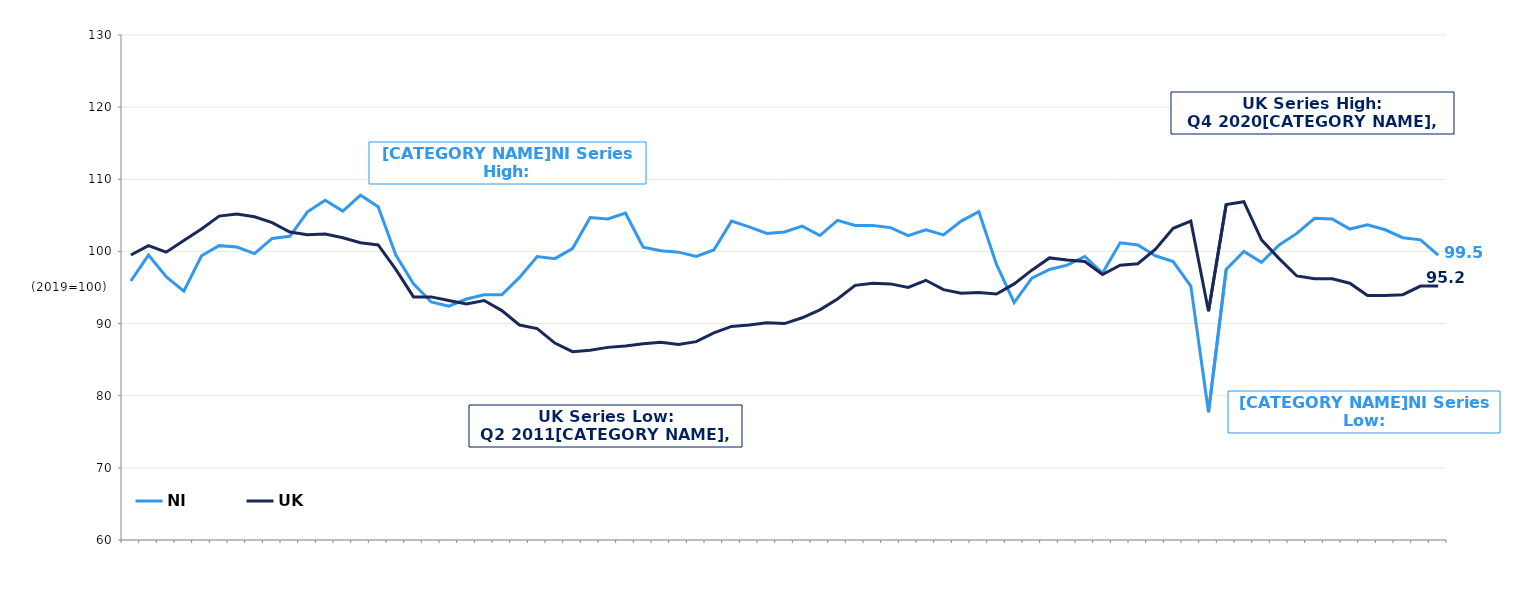
| Category | NI | UK  |
|---|---|---|
|  | 95.9 | 99.5 |
|  | 99.5 | 100.8 |
| Q3 2005 | 96.5 | 99.9 |
|  | 94.5 | 101.5 |
|  | 99.4 | 103.1 |
|  | 100.8 | 104.9 |
| Q3 2006 | 100.6 | 105.2 |
|  | 99.7 | 104.8 |
|  | 101.8 | 104 |
|  | 102.1 | 102.7 |
| Q3 2007 | 105.5 | 102.3 |
|  | 107.1 | 102.4 |
|  | 105.6 | 101.9 |
|  | 107.8 | 101.2 |
| Q3 2008 | 106.2 | 100.9 |
|  | 99.5 | 97.5 |
|  | 95.5 | 93.7 |
|  | 93 | 93.7 |
| Q3 2009 | 92.4 | 93.2 |
|  | 93.4 | 92.7 |
|  | 94 | 93.2 |
|  | 94 | 91.8 |
| Q3 2010 | 96.4 | 89.8 |
|  | 99.3 | 89.3 |
|  | 99 | 87.3 |
|  | 100.4 | 86.1 |
| Q3 2011 | 104.7 | 86.3 |
|  | 104.5 | 86.7 |
|  | 105.3 | 86.9 |
|  | 100.6 | 87.2 |
| Q3 2012 | 100.1 | 87.4 |
|  | 99.9 | 87.1 |
|  | 99.3 | 87.5 |
|  | 100.2 | 88.7 |
| Q3 2013 | 104.2 | 89.6 |
|  | 103.4 | 89.8 |
|  | 102.5 | 90.1 |
|  | 102.7 | 90 |
| Q3 2014 | 103.5 | 90.8 |
|  | 102.2 | 91.9 |
|  | 104.3 | 93.4 |
|  | 103.6 | 95.3 |
| Q3 2015 | 103.6 | 95.6 |
|  | 103.3 | 95.5 |
|  | 102.2 | 95 |
|  | 103 | 96 |
| Q3 2016 | 102.3 | 94.7 |
|  | 104.2 | 94.2 |
|  | 105.5 | 94.3 |
|  | 98.2 | 94.1 |
| Q3 2017 | 92.9 | 95.5 |
|  | 96.3 | 97.4 |
|  | 97.5 | 99.1 |
|  | 98.1 | 98.8 |
| Q3 2018 | 99.3 | 98.6 |
|  | 97 | 96.8 |
|  | 101.2 | 98.1 |
|  | 100.9 | 98.3 |
| Q3 2019 | 99.4 | 100.3 |
|  | 98.6 | 103.2 |
|  | 95.2 | 104.2 |
|  | 77.7 | 91.7 |
| Q3 2020 | 97.5 | 106.5 |
|  | 100 | 106.9 |
|  | 98.5 | 101.6 |
|  | 100.9 | 99 |
| Q3 2021 | 102.5 | 96.6 |
|  | 104.6 | 96.2 |
|  | 104.5 | 96.2 |
|  | 103.1 | 95.6 |
| Q3 2022 | 103.7 | 93.9 |
|  | 103 | 93.9 |
|  | 101.9 | 94 |
|  | 101.6 | 95.2 |
| Q3 2023 | 99.5 | 95.2 |